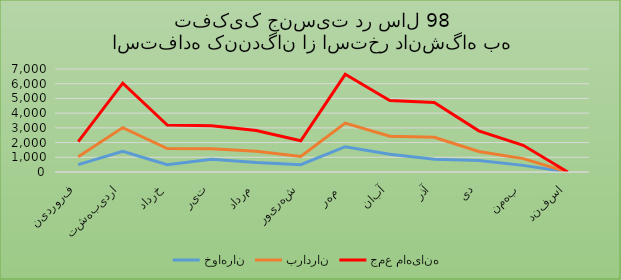
| Category | خواهران | برادران | جمع ماهیانه |
|---|---|---|---|
| فروردین | 500 | 532 | 1032 |
| اردیبهشت | 1400 | 1618 | 3018 |
| خرداد | 500 | 1098 | 1598 |
| تیر | 872 | 700 | 1572 |
| مرداد | 650 | 758 | 1408 |
| شهریور | 500 | 560 | 1060 |
| مهر  | 1719 | 1600 | 3319 |
| آبان | 1200 | 1232 | 2432 |
| آذر | 865 | 1500 | 2365 |
| دی | 780 | 618 | 1398 |
| بهمن | 450 | 458 | 908 |
| اسفند | 0 | 0 | 0 |